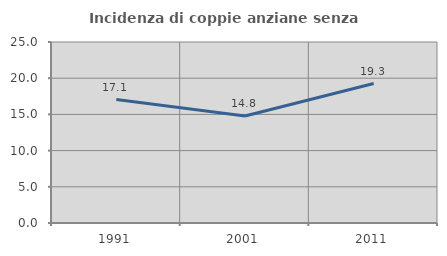
| Category | Incidenza di coppie anziane senza figli  |
|---|---|
| 1991.0 | 17.054 |
| 2001.0 | 14.773 |
| 2011.0 | 19.259 |